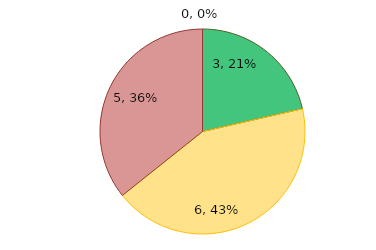
| Category | Series 0 |
|---|---|
| Abaixo do limite alerta | 3 |
| Entre o limite alerta e o máximo | 6 |
| Acima do limite máximo | 5 |
| Não informaram | 0 |